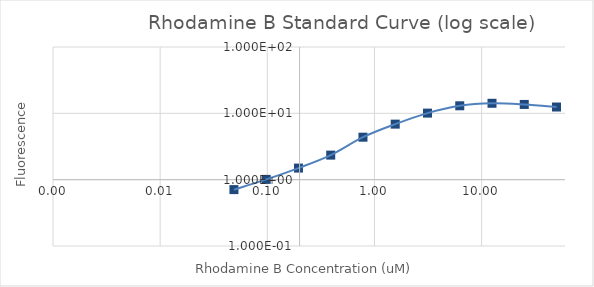
| Category | Series 1 |
|---|---|
| 50.0 | 12.449 |
| 25.0 | 13.616 |
| 12.5 | 14.174 |
| 6.25 | 12.994 |
| 3.125 | 10.075 |
| 1.5625 | 6.872 |
| 0.78125 | 4.368 |
| 0.390625 | 2.345 |
| 0.1953125 | 1.495 |
| 0.09765625 | 1.009 |
| 0.048828125 | 0.708 |